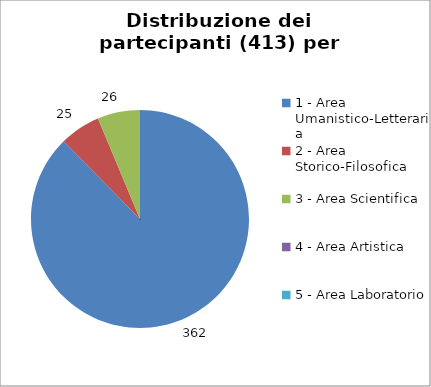
| Category | Nr. Partecipanti |
|---|---|
| 1 - Area Umanistico-Letteraria | 362 |
| 2 - Area Storico-Filosofica | 25 |
| 3 - Area Scientifica | 26 |
| 4 - Area Artistica | 0 |
| 5 - Area Laboratorio | 0 |